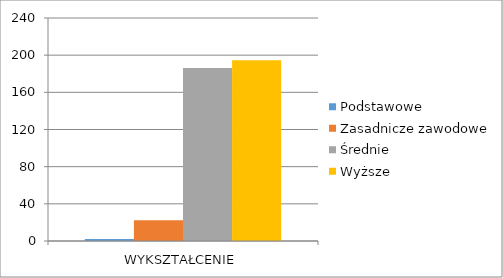
| Category | Podstawowe | Zasadnicze zawodowe | Średnie | Wyższe |
|---|---|---|---|---|
| WYKSZTAŁCENIE | 2.025 | 22.275 | 186.3 | 194.4 |